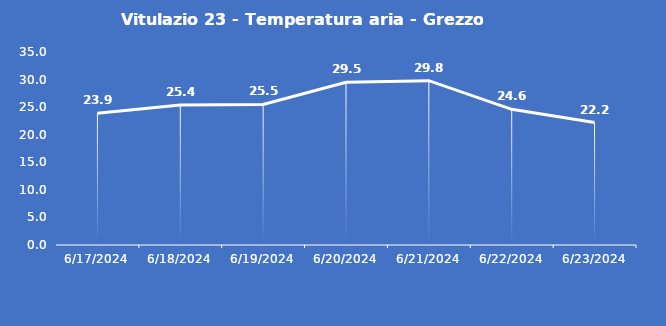
| Category | Vitulazio 23 - Temperatura aria - Grezzo (°C) |
|---|---|
| 6/17/24 | 23.9 |
| 6/18/24 | 25.4 |
| 6/19/24 | 25.5 |
| 6/20/24 | 29.5 |
| 6/21/24 | 29.8 |
| 6/22/24 | 24.6 |
| 6/23/24 | 22.2 |